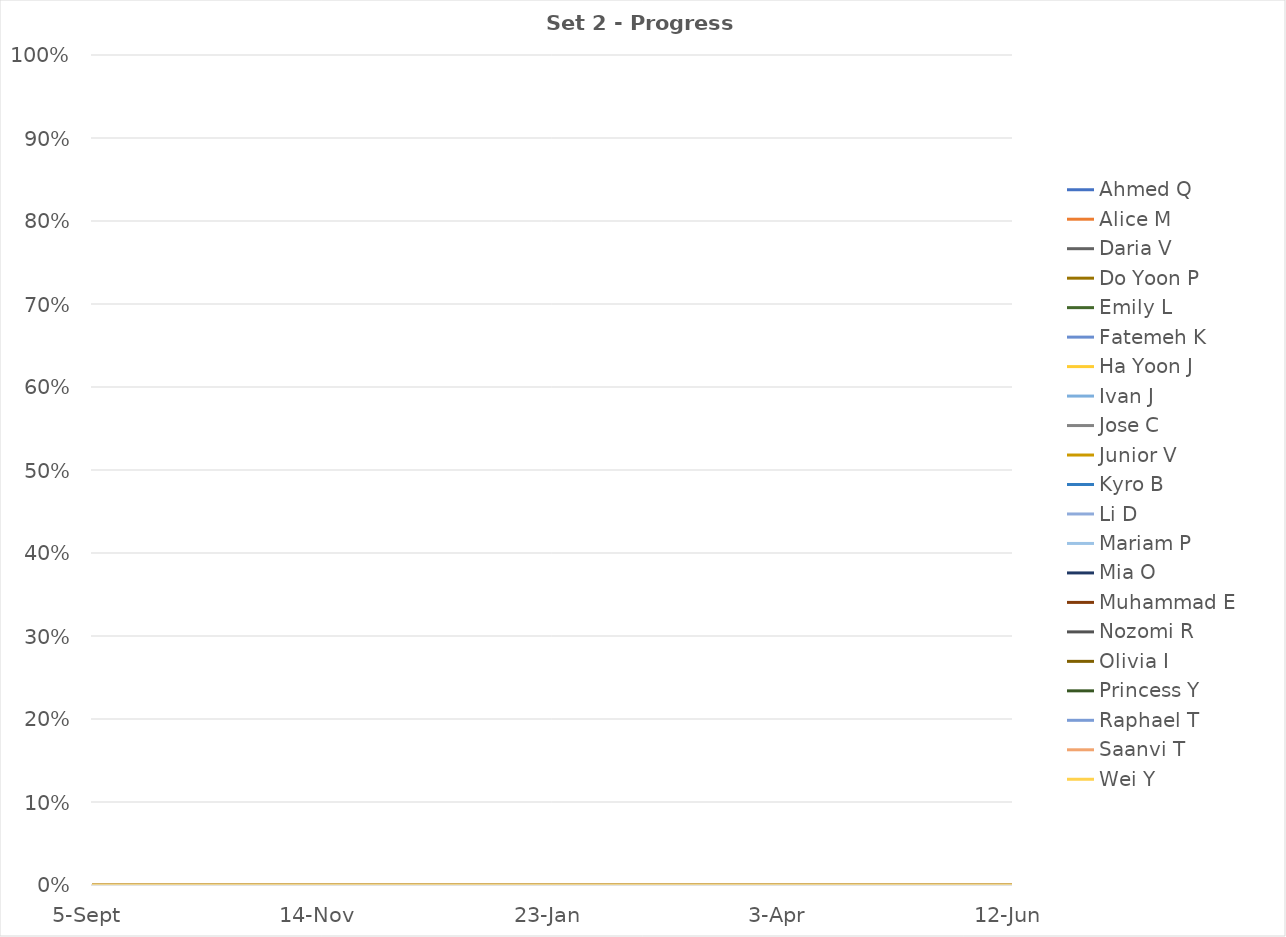
| Category | Ahmed Q | Alice M | Daria V | Do Yoon P | Emily L | Fatemeh K | Ha Yoon J | Ivan J | Jose C | Junior V | Kyro B | Li D | Mariam P | Mia O | Muhammad E | Nozomi R | Olivia I | Princess Y | Raphael T | Saanvi T | Wei Y |
|---|---|---|---|---|---|---|---|---|---|---|---|---|---|---|---|---|---|---|---|---|---|
| 2022-09-05 | 0 | 0 | 0 | 0 | 0 | 0 | 0 | 0 | 0 | 0 | 0 | 0 | 0 | 0 | 0 | 0 | 0 | 0 | 0 | 0 | 0 |
| 2022-11-14 | 0 | 0 | 0 | 0 | 0 | 0 | 0 | 0 | 0 | 0 | 0 | 0 | 0 | 0 | 0 | 0 | 0 | 0 | 0 | 0 | 0 |
| 2023-01-23 | 0 | 0 | 0 | 0 | 0 | 0 | 0 | 0 | 0 | 0 | 0 | 0 | 0 | 0 | 0 | 0 | 0 | 0 | 0 | 0 | 0 |
| 2023-04-03 | 0 | 0 | 0 | 0 | 0 | 0 | 0 | 0 | 0 | 0 | 0 | 0 | 0 | 0 | 0 | 0 | 0 | 0 | 0 | 0 | 0 |
| 2023-06-12 | 0 | 0 | 0 | 0 | 0 | 0 | 0 | 0 | 0 | 0 | 0 | 0 | 0 | 0 | 0 | 0 | 0 | 0 | 0 | 0 | 0 |